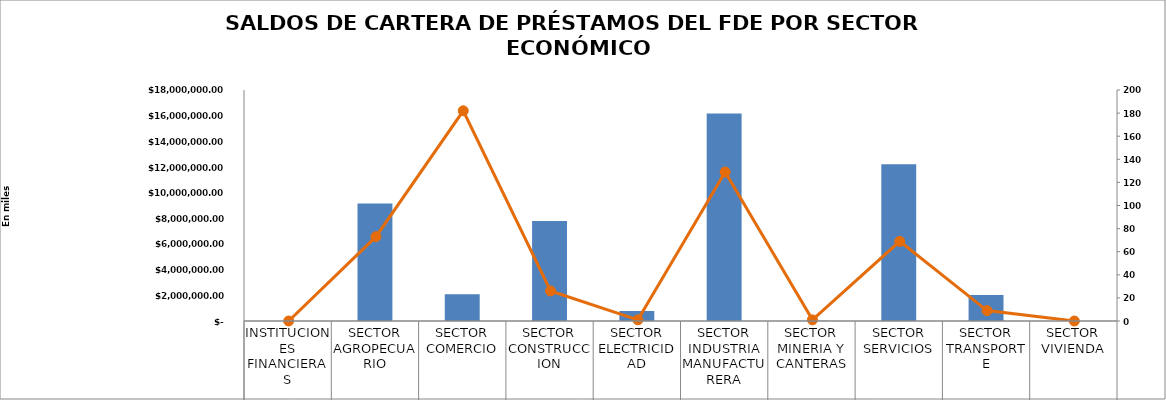
| Category |  Saldo del Crédito en Miles US$ |
|---|---|
| INSTITUCIONES FINANCIERAS | 0 |
| SECTOR AGROPECUARIO | 9161172.96 |
| SECTOR COMERCIO | 2084369.81 |
| SECTOR CONSTRUCCION | 7794452.43 |
| SECTOR ELECTRICIDAD | 770503.46 |
| SECTOR INDUSTRIA MANUFACTURERA | 16168924.39 |
| SECTOR MINERIA Y CANTERAS | 23347.26 |
| SECTOR SERVICIOS | 12212491.6 |
| SECTOR TRANSPORTE | 2034264.36 |
| SECTOR VIVIENDA | 0 |